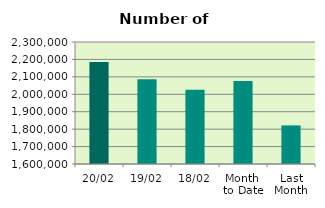
| Category | Series 0 |
|---|---|
| 20/02 | 2185698 |
| 19/02 | 2086224 |
| 18/02 | 2025416 |
| Month 
to Date | 2076522.143 |
| Last
Month | 1821445.364 |